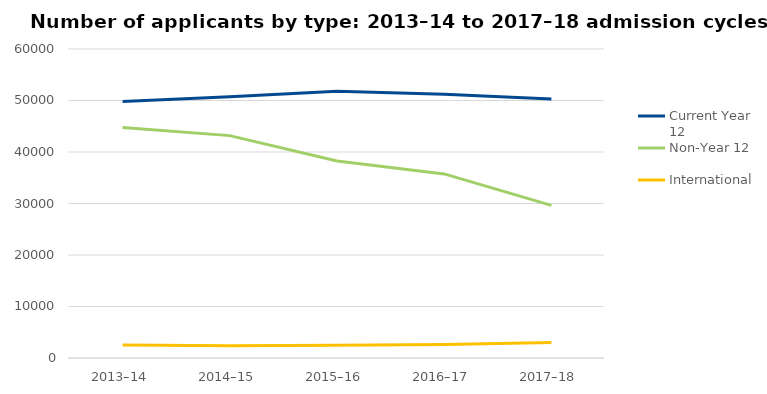
| Category | Current Year 12 | Non-Year 12 | International |
|---|---|---|---|
| 2013–14 | 49796 | 44761 | 2529 |
| 2014–15 | 50709 | 43179 | 2373 |
| 2015–16 | 51780 | 38243 | 2482 |
| 2016–17 | 51209 | 35748 | 2599 |
| 2017–18 | 50306 | 29636 | 3032 |